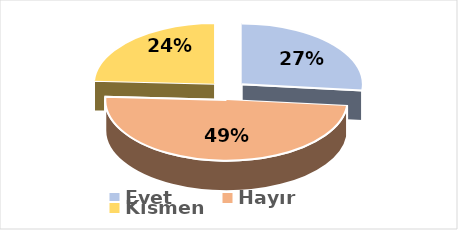
| Category | Evet |
|---|---|
| Evet | 0.266 |
| Hayır | 0.492 |
| Kısmen | 0.242 |